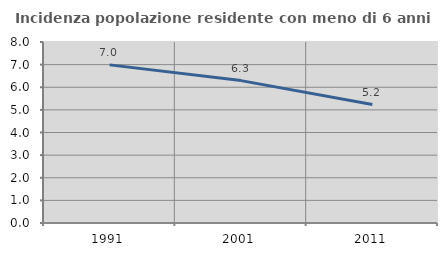
| Category | Incidenza popolazione residente con meno di 6 anni |
|---|---|
| 1991.0 | 6.989 |
| 2001.0 | 6.293 |
| 2011.0 | 5.237 |